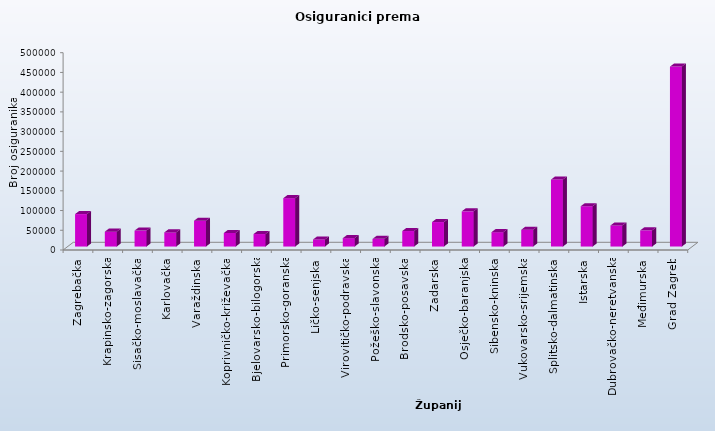
| Category | Series 0 |
|---|---|
| Zagrebačka | 82241 |
| Krapinsko-zagorska | 37669 |
| Sisačko-moslavačka | 40412 |
| Karlovačka | 35759 |
| Varaždinska | 65408 |
| Koprivničko-križevačka | 34283 |
| Bjelovarsko-bilogorska | 31684 |
| Primorsko-goranska | 122577 |
| Ličko-senjska | 17902 |
| Virovitičko-podravska | 21214 |
| Požeško-slavonska | 19438 |
| Brodsko-posavska | 39302 |
| Zadarska | 62028 |
| Osječko-baranjska | 89185 |
| Šibensko-kninska | 36416 |
| Vukovarsko-srijemska | 42568 |
| Splitsko-dalmatinska | 169723 |
| Istarska | 102127 |
| Dubrovačko-neretvanska | 53404 |
| Međimurska | 41048 |
| Grad Zagreb | 456017 |